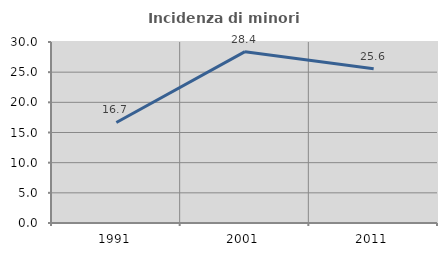
| Category | Incidenza di minori stranieri |
|---|---|
| 1991.0 | 16.667 |
| 2001.0 | 28.402 |
| 2011.0 | 25.576 |